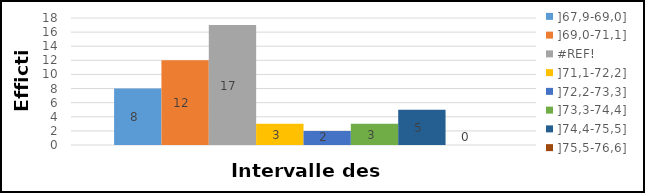
| Category | ]67,9-69,0] | ]69,0-71,1] | #REF! | ]71,1-72,2] | ]72,2-73,3] | ]73,3-74,4] | ]74,4-75,5] | ]75,5-76,6] |
|---|---|---|---|---|---|---|---|---|
| Intervalle de classe | 8 | 12 | 17 | 3 | 2 | 3 | 5 | 0 |